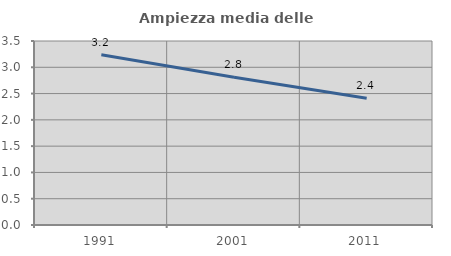
| Category | Ampiezza media delle famiglie |
|---|---|
| 1991.0 | 3.237 |
| 2001.0 | 2.809 |
| 2011.0 | 2.412 |